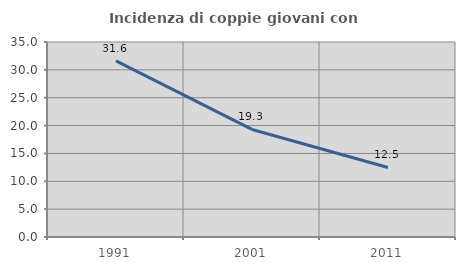
| Category | Incidenza di coppie giovani con figli |
|---|---|
| 1991.0 | 31.612 |
| 2001.0 | 19.306 |
| 2011.0 | 12.485 |